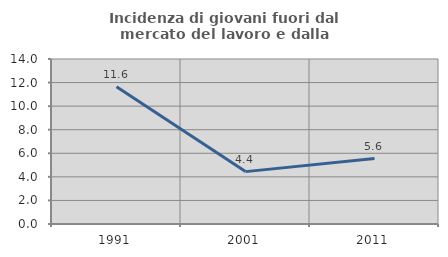
| Category | Incidenza di giovani fuori dal mercato del lavoro e dalla formazione  |
|---|---|
| 1991.0 | 11.647 |
| 2001.0 | 4.444 |
| 2011.0 | 5.556 |